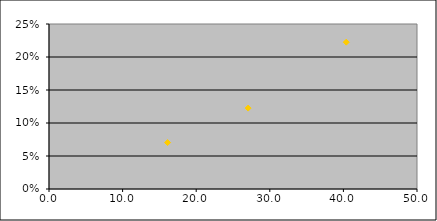
| Category | Series 0 |
|---|---|
| 16.113074204946997 | 0.07 |
| 40.3875968992248 | 0.222 |
| 27.05609756097561 | 0.123 |